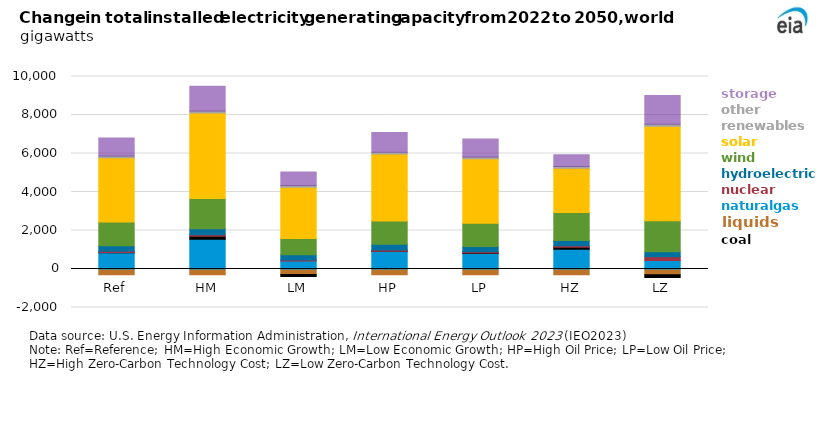
| Category | Liquids | Natural gas | Coal | Nuclear | Hydro | Wind | Solar | Other renew | Storage |
|---|---|---|---|---|---|---|---|---|---|
| Ref | -294.55 | 849.579 | 4.399 | 68.444 | 289.836 | 1234.089 | 3329.407 | 93.266 | 936.291 |
| HM | -294.453 | 1543.624 | 161.69 | 72.406 | 314.668 | 1571.134 | 4437.938 | 100.839 | 1285.967 |
| LM | -291.712 | 420.613 | -101.901 | 50.327 | 271.261 | 844.715 | 2662.531 | 85.508 | 702.598 |
| HP | -292.813 | 915.846 | 11.413 | 64.28 | 297.027 | 1208.535 | 3474.119 | 93.478 | 1032.482 |
| LP | -295.019 | 808.308 | 21.271 | 70.115 | 271.843 | 1200.409 | 3349.679 | 93.05 | 944.137 |
| HZ | -295.683 | 1031.76 | 92.585 | 81.858 | 274.199 | 1452.242 | 2298.144 | 93.22 | 616.053 |
| LZ | -298.908 | 441.748 | -147.427 | 194.378 | 255.187 | 1620.327 | 4900.274 | 103.645 | 1497.999 |